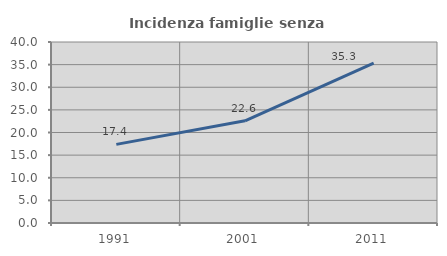
| Category | Incidenza famiglie senza nuclei |
|---|---|
| 1991.0 | 17.378 |
| 2001.0 | 22.584 |
| 2011.0 | 35.326 |